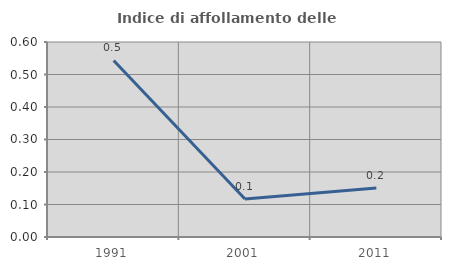
| Category | Indice di affollamento delle abitazioni  |
|---|---|
| 1991.0 | 0.543 |
| 2001.0 | 0.117 |
| 2011.0 | 0.151 |